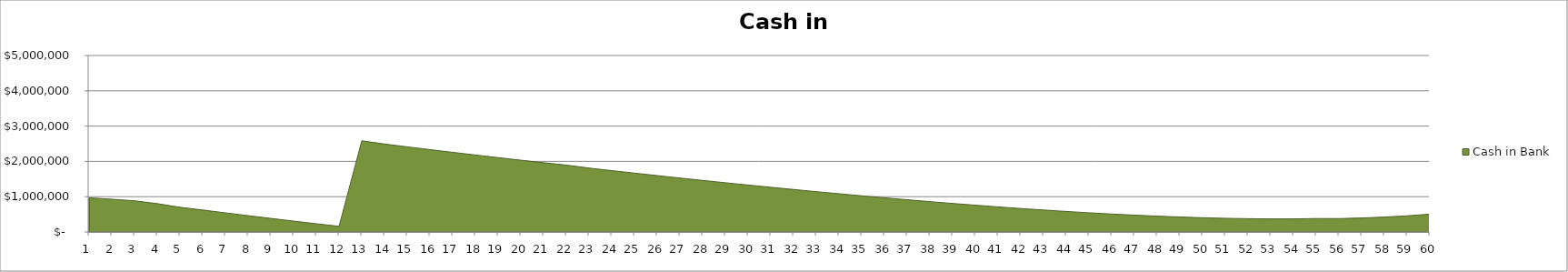
| Category | Cash in Bank |
|---|---|
| 0 | 967395.342 |
| 1 | 928367.552 |
| 2 | 883581.49 |
| 3 | 802868.505 |
| 4 | 699900.314 |
| 5 | 622393.36 |
| 6 | 541425.557 |
| 7 | 462034.26 |
| 8 | 384198.357 |
| 9 | 307928.972 |
| 10 | 233190.727 |
| 11 | 159974.971 |
| 12 | 2583807.098 |
| 13 | 2492249.767 |
| 14 | 2412176.412 |
| 15 | 2333586.265 |
| 16 | 2256465.547 |
| 17 | 2180791.31 |
| 18 | 2106550.488 |
| 19 | 2033745.299 |
| 20 | 1962395.483 |
| 21 | 1894467.465 |
| 22 | 1810871.32 |
| 23 | 1738482.612 |
| 24 | 1667317.816 |
| 25 | 1597350.078 |
| 26 | 1528606.814 |
| 27 | 1461100.973 |
| 28 | 1394838.414 |
| 29 | 1329849.578 |
| 30 | 1266138.419 |
| 31 | 1203756.361 |
| 32 | 1142721.304 |
| 33 | 1083089.879 |
| 34 | 1024931.859 |
| 35 | 968277.315 |
| 36 | 913220.885 |
| 37 | 859864 |
| 38 | 808275.638 |
| 39 | 758583.413 |
| 40 | 710918.489 |
| 41 | 665405.041 |
| 42 | 622236.585 |
| 43 | 581553.863 |
| 44 | 543594.491 |
| 45 | 508545.468 |
| 46 | 476688.427 |
| 47 | 448309.561 |
| 48 | 423707.421 |
| 49 | 403247.967 |
| 50 | 387319.768 |
| 51 | 376314.723 |
| 52 | 370764.43 |
| 53 | 371202.477 |
| 54 | 380013.171 |
| 55 | 379184.881 |
| 56 | 396375.252 |
| 57 | 422416.03 |
| 58 | 458228.488 |
| 59 | 504840.173 |